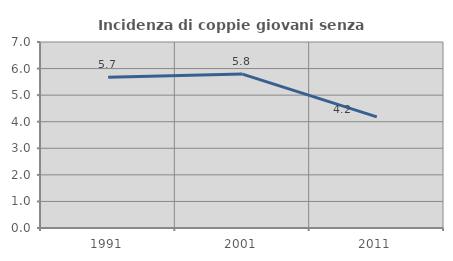
| Category | Incidenza di coppie giovani senza figli |
|---|---|
| 1991.0 | 5.671 |
| 2001.0 | 5.791 |
| 2011.0 | 4.182 |